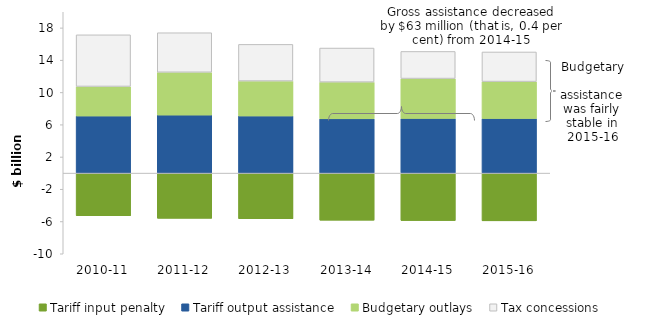
| Category | Tariff input penalty | Tariff output assistance | Budgetary outlays | Tax concessions |
|---|---|---|---|---|
| 2010-11 | -5.282 | 7.084 | 3.657 | 6.401 |
| 2011-12 | -5.612 | 7.194 | 5.305 | 4.9 |
| 2012-13 | -5.658 | 7.09 | 4.32 | 4.546 |
| 2013-14 | -5.838 | 6.725 | 4.554 | 4.225 |
| 2014-15 | -5.888 | 6.78 | 4.94 | 3.361 |
| 2015-16 | -5.924 | 6.764 | 4.581 | 3.673 |